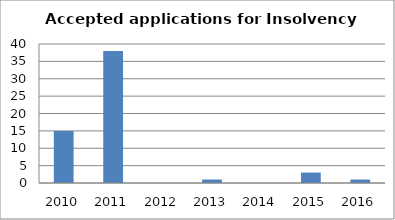
| Category | Series 0 |
|---|---|
| 2010.0 | 15 |
| 2011.0 | 38 |
| 2012.0 | 0 |
| 2013.0 | 1 |
| 2014.0 | 0 |
| 2015.0 | 3 |
| 2016.0 | 1 |